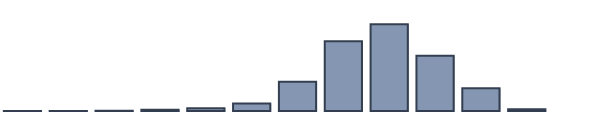
| Category | Series 0 |
|---|---|
| 0 | 0.043 |
| 1 | 0.043 |
| 2 | 0.087 |
| 3 | 0.435 |
| 4 | 0.957 |
| 5 | 2.696 |
| 6 | 10.565 |
| 7 | 25.174 |
| 8 | 31.304 |
| 9 | 19.87 |
| 10 | 8.217 |
| 11 | 0.609 |
| 12 | 0 |